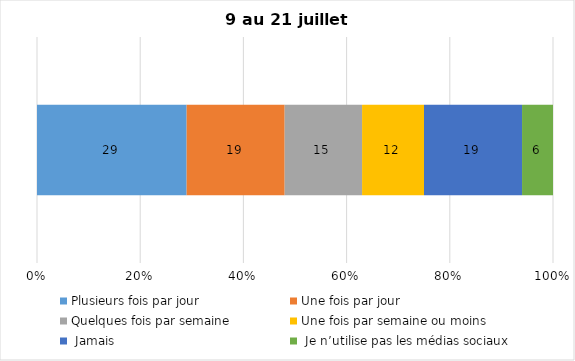
| Category | Plusieurs fois par jour | Une fois par jour | Quelques fois par semaine   | Une fois par semaine ou moins   |  Jamais   |  Je n’utilise pas les médias sociaux |
|---|---|---|---|---|---|---|
| 0 | 29 | 19 | 15 | 12 | 19 | 6 |